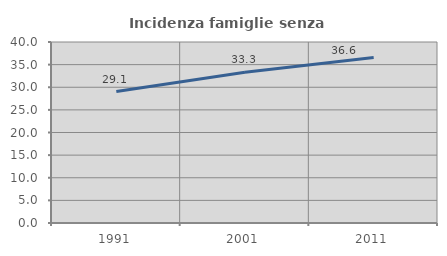
| Category | Incidenza famiglie senza nuclei |
|---|---|
| 1991.0 | 29.053 |
| 2001.0 | 33.333 |
| 2011.0 | 36.57 |